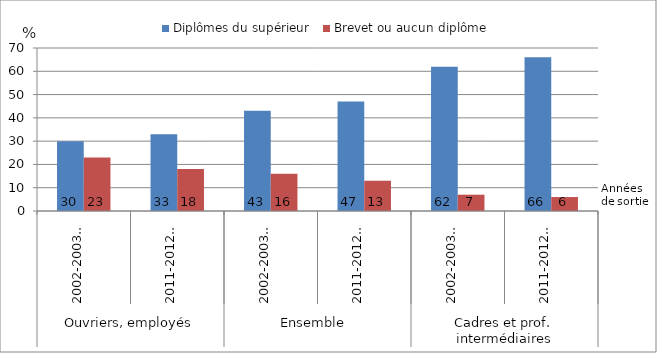
| Category | Diplômes du supérieur | Brevet ou aucun diplôme |
|---|---|---|
| 0 | 30 | 23 |
| 01/01/1900 | 33 | 18 |
| 02/01/1900 | 43 | 16 |
| 03/01/1900 | 47 | 13 |
| 04/01/1900 | 62 | 7 |
| 05/01/1900 | 66 | 6 |